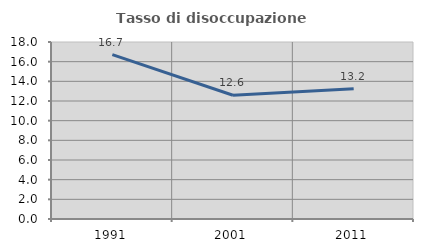
| Category | Tasso di disoccupazione giovanile  |
|---|---|
| 1991.0 | 16.708 |
| 2001.0 | 12.587 |
| 2011.0 | 13.242 |